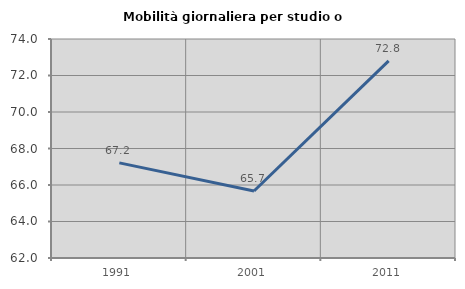
| Category | Mobilità giornaliera per studio o lavoro |
|---|---|
| 1991.0 | 67.213 |
| 2001.0 | 65.669 |
| 2011.0 | 72.799 |